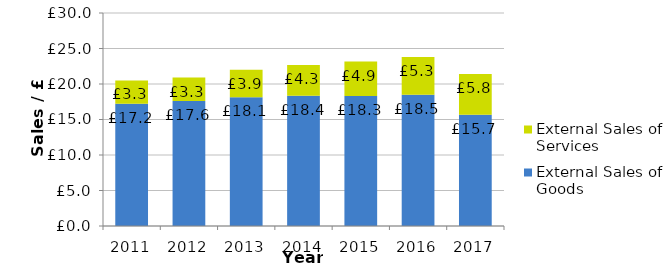
| Category | External Sales of Goods | External Sales of Services |
|---|---|---|
| 2011.0 | 17.209 | 3.299 |
| 2012.0 | 17.589 | 3.319 |
| 2013.0 | 18.146 | 3.851 |
| 2014.0 | 18.357 | 4.307 |
| 2015.0 | 18.293 | 4.874 |
| 2016.0 | 18.472 | 5.34 |
| 2017.0 | 15.659 | 5.751 |